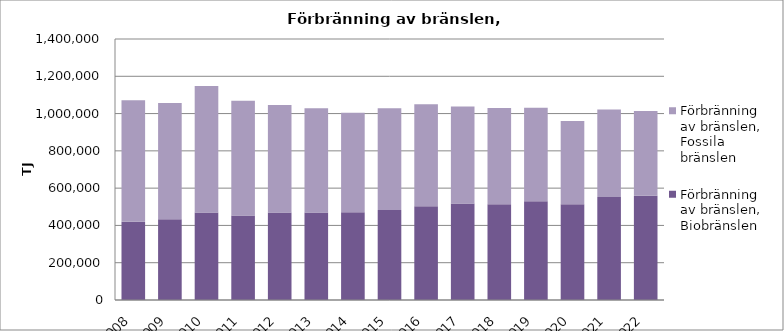
| Category | Förbränning av bränslen, Biobränslen | Förbränning av bränslen, Fossila bränslen |
|---|---|---|
| 2008 | 419334.859 | 652644.092 |
| 2009 | 432688.505 | 624505.673 |
| 2010 | 469547.338 | 678120.06 |
| 2011 | 453395.002 | 615103.626 |
| 2012 | 469136.98 | 576221.803 |
| 2013 | 469400.804 | 558603.936 |
| 2014 | 470982.487 | 533972.186 |
| 2015 | 483153.842 | 545426.236 |
| 2016 | 503264.134 | 546840.327 |
| 2017 | 517974.332 | 519791.97 |
| 2018 | 513704.114 | 516775.76 |
| 2019 | 529760.364 | 501916.656 |
| 2020 | 513085.704 | 447638.856 |
| 2021 | 553081.686 | 468192.916 |
| 2022 | 558758.709 | 454787.681 |